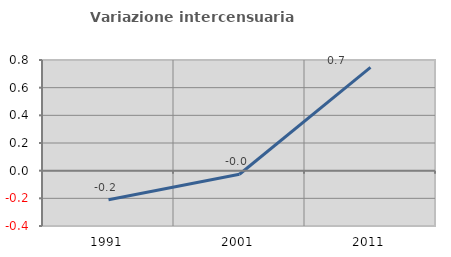
| Category | Variazione intercensuaria annua |
|---|---|
| 1991.0 | -0.21 |
| 2001.0 | -0.026 |
| 2011.0 | 0.746 |